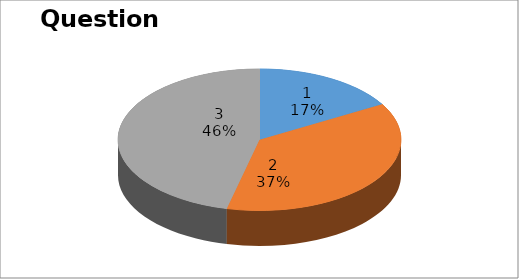
| Category | Series 0 |
|---|---|
| 0 | 9 |
| 1 | 20 |
| 2 | 25 |